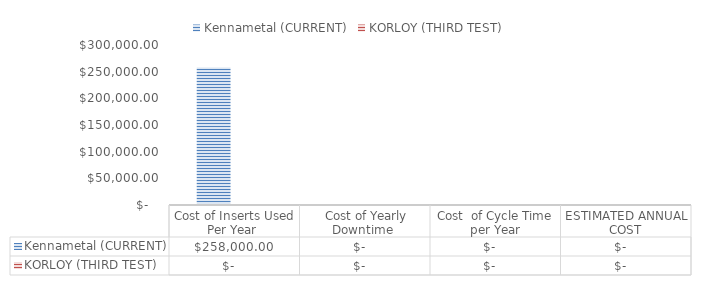
| Category | Kennametal (CURRENT) | KORLOY (THIRD TEST) |
|---|---|---|
| Cost of Inserts Used Per Year  | 258000 | 0 |
|  Cost of Yearly Downtime  | 0 | 0 |
| Cost  of Cycle Time per Year | 0 | 0 |
| ESTIMATED ANNUAL COST | 0 | 0 |